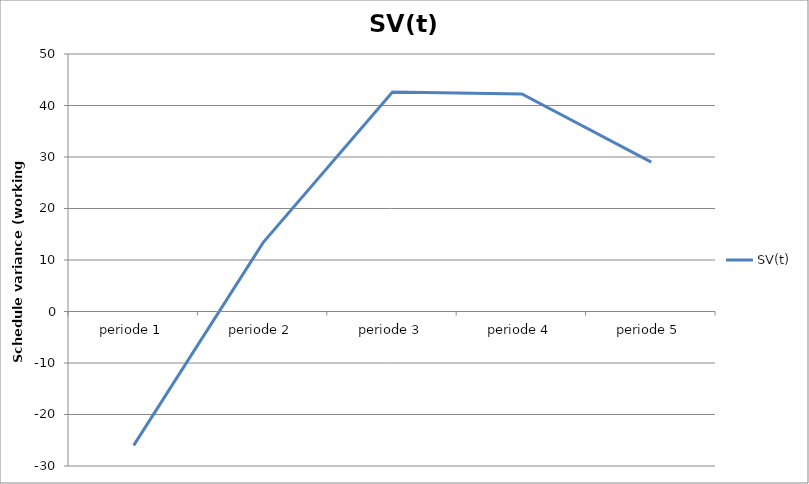
| Category | SV(t) |
|---|---|
| periode 1 | -26 |
| periode 2 | 13.375 |
| periode 3 | 42.625 |
| periode 4 | 42.25 |
| periode 5 | 29 |